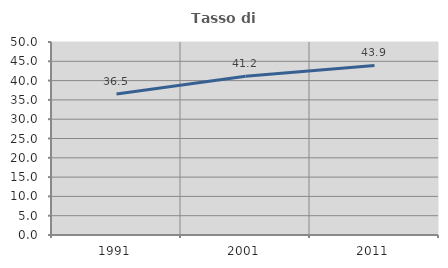
| Category | Tasso di occupazione   |
|---|---|
| 1991.0 | 36.546 |
| 2001.0 | 41.154 |
| 2011.0 | 43.925 |